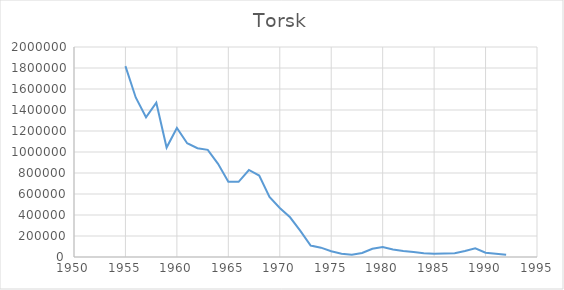
| Category | Series 0 |
|---|---|
| 1955.0 | 1817484 |
| 1956.0 | 1519495 |
| 1957.0 | 1331280 |
| 1958.0 | 1469227 |
| 1959.0 | 1042375 |
| 1960.0 | 1228850 |
| 1961.0 | 1083431 |
| 1962.0 | 1035904 |
| 1963.0 | 1020359 |
| 1964.0 | 887216 |
| 1965.0 | 716209 |
| 1966.0 | 715515 |
| 1967.0 | 828645 |
| 1968.0 | 775887 |
| 1969.0 | 572007 |
| 1970.0 | 466971 |
| 1971.0 | 378343 |
| 1972.0 | 248141 |
| 1973.0 | 109533 |
| 1974.0 | 88940 |
| 1975.0 | 54787 |
| 1976.0 | 30131 |
| 1977.0 | 20604 |
| 1978.0 | 37794 |
| 1979.0 | 78818 |
| 1980.0 | 94123 |
| 1981.0 | 71075 |
| 1982.0 | 57228 |
| 1983.0 | 46589 |
| 1984.0 | 35644 |
| 1985.0 | 29874 |
| 1986.0 | 32906 |
| 1987.0 | 36166 |
| 1988.0 | 56409 |
| 1989.0 | 83625 |
| 1990.0 | 41003 |
| 1991.0 | 30227 |
| 1992.0 | 20732 |